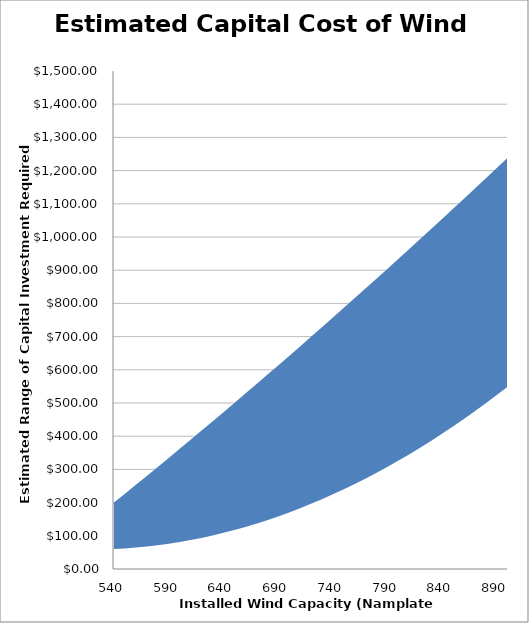
| Category | Max | Min |
|---|---|---|
| 540.0 | 200 | 60 |
| 550.0 | 226.66 | 61.863 |
| 560.0 | 253.448 | 64.398 |
| 570.0 | 280.363 | 67.604 |
| 580.0 | 307.406 | 71.481 |
| 590.0 | 334.576 | 76.03 |
| 600.0 | 361.874 | 81.249 |
| 610.0 | 389.298 | 87.141 |
| 620.0 | 416.85 | 93.703 |
| 630.0 | 444.53 | 100.937 |
| 640.0 | 472.336 | 108.842 |
| 650.0 | 500.27 | 117.418 |
| 660.0 | 528.332 | 126.666 |
| 670.0 | 556.52 | 136.585 |
| 680.0 | 584.836 | 147.175 |
| 690.0 | 613.279 | 158.437 |
| 700.0 | 641.85 | 170.37 |
| 710.0 | 670.548 | 182.974 |
| 720.0 | 699.373 | 196.249 |
| 730.0 | 728.325 | 210.196 |
| 740.0 | 757.405 | 224.814 |
| 750.0 | 786.612 | 240.103 |
| 760.0 | 815.947 | 256.064 |
| 770.0 | 845.408 | 272.696 |
| 780.0 | 875 | 290 |
| 790.0 | 904.714 | 307.974 |
| 800.0 | 934.558 | 326.619 |
| 810.0 | 964.529 | 345.937 |
| 820.0 | 994.627 | 365.925 |
| 830.0 | 1024.853 | 386.585 |
| 840.0 | 1055.205 | 407.916 |
| 850.0 | 1085.686 | 429.918 |
| 860.0 | 1116.293 | 452.591 |
| 870.0 | 1147.028 | 475.936 |
| 880.0 | 1177.89 | 499.953 |
| 890.0 | 1208.88 | 524.64 |
| 900.0 | 1240 | 550 |